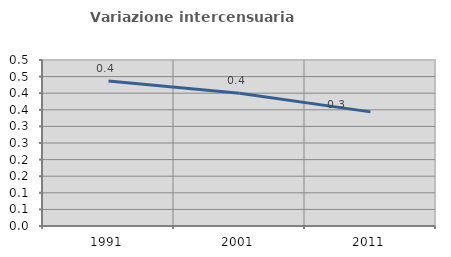
| Category | Variazione intercensuaria annua |
|---|---|
| 1991.0 | 0.436 |
| 2001.0 | 0.4 |
| 2011.0 | 0.344 |